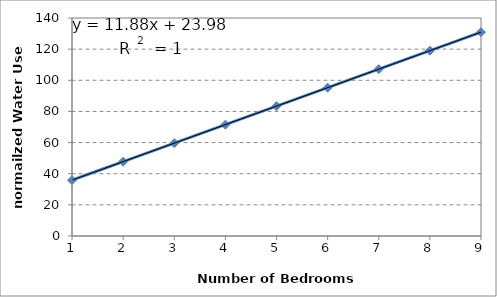
| Category | Series 0 |
|---|---|
| 1.0 | 35.86 |
| 2.0 | 47.74 |
| 3.0 | 59.62 |
| 4.0 | 71.5 |
| 5.0 | 83.38 |
| 6.0 | 95.26 |
| 7.0 | 107.14 |
| 8.0 | 119.02 |
| 9.0 | 130.9 |